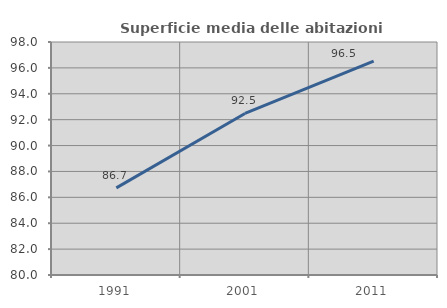
| Category | Superficie media delle abitazioni occupate |
|---|---|
| 1991.0 | 86.733 |
| 2001.0 | 92.478 |
| 2011.0 | 96.524 |